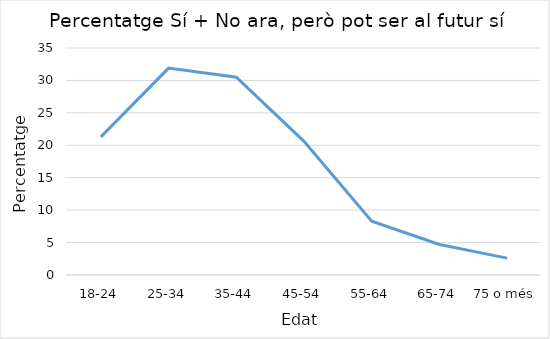
| Category | Series 0 |
|---|---|
| 18-24 | 21.3 |
| 25-34 | 31.9 |
| 35-44 | 30.5 |
| 45-54 | 20.6 |
| 55-64 | 8.3 |
| 65-74 | 4.7 |
| 75 o més | 2.6 |